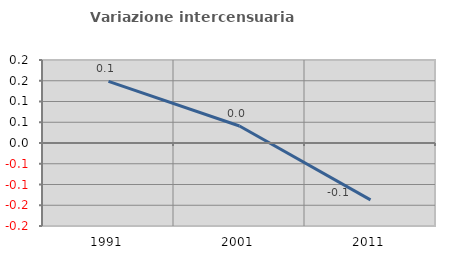
| Category | Variazione intercensuaria annua |
|---|---|
| 1991.0 | 0.148 |
| 2001.0 | 0.041 |
| 2011.0 | -0.137 |